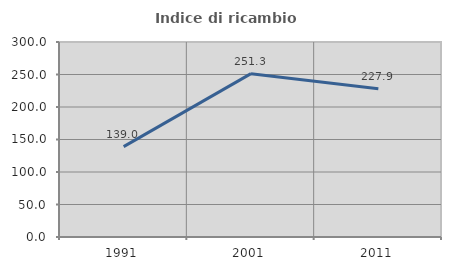
| Category | Indice di ricambio occupazionale  |
|---|---|
| 1991.0 | 138.961 |
| 2001.0 | 251.282 |
| 2011.0 | 227.907 |